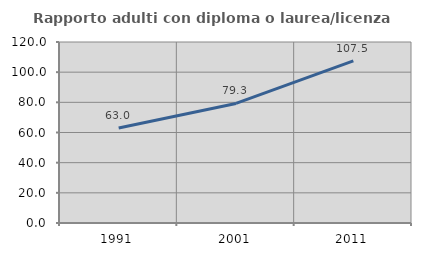
| Category | Rapporto adulti con diploma o laurea/licenza media  |
|---|---|
| 1991.0 | 63.023 |
| 2001.0 | 79.252 |
| 2011.0 | 107.488 |